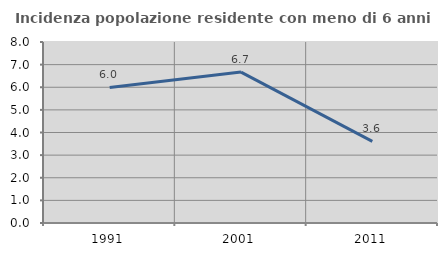
| Category | Incidenza popolazione residente con meno di 6 anni |
|---|---|
| 1991.0 | 5.992 |
| 2001.0 | 6.671 |
| 2011.0 | 3.606 |